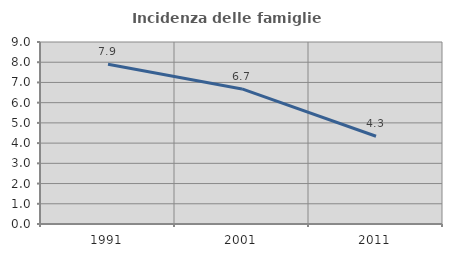
| Category | Incidenza delle famiglie numerose |
|---|---|
| 1991.0 | 7.899 |
| 2001.0 | 6.678 |
| 2011.0 | 4.341 |